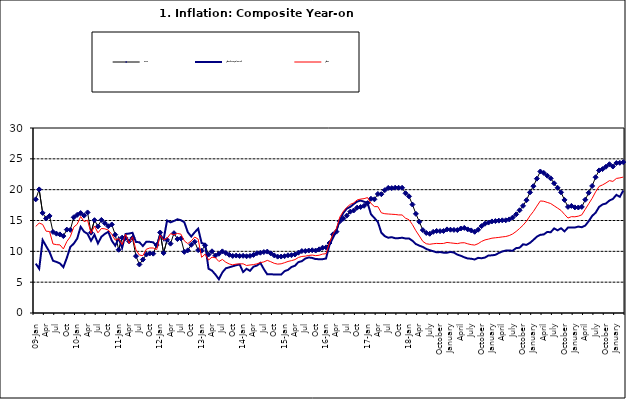
| Category | Food | All Items less Farm Produce | All Items |
|---|---|---|---|
| 09-Jan | 18.436 | 8.013 | 14.034 |
| Feb | 20.041 | 7.178 | 14.584 |
| Mar | 16.233 | 11.842 | 14.366 |
| Apr | 15.342 | 10.85 | 13.268 |
| May | 15.74 | 9.88 | 13.212 |
| June | 13.138 | 8.472 | 11.194 |
| Jul | 12.867 | 8.285 | 11.09 |
| Aug | 12.746 | 8.044 | 11.046 |
| Sep | 12.472 | 7.431 | 10.39 |
| Oct | 13.524 | 8.933 | 11.588 |
| Nov | 13.482 | 10.702 | 12.368 |
| Dec | 15.518 | 11.249 | 13.93 |
| 10-Jan | 15.918 | 12.063 | 14.398 |
| Feb | 16.208 | 13.978 | 15.649 |
| Mar | 15.79 | 13.184 | 14.812 |
| Apr | 16.306 | 12.844 | 15.044 |
| May | 13.023 | 11.711 | 12.915 |
| Jun | 15.053 | 12.686 | 14.099 |
| Jul | 14.043 | 11.287 | 13.002 |
| Aug | 15.09 | 12.366 | 13.702 |
| Sep | 14.57 | 12.83 | 13.65 |
| Oct | 14.065 | 13.168 | 13.45 |
| Nov | 14.351 | 11.746 | 12.766 |
| Dec | 12.701 | 10.917 | 11.815 |
| 11-Jan | 10.255 | 12.118 | 12.08 |
| Feb | 12.221 | 10.569 | 11.1 |
| Mar | 12.169 | 12.815 | 12.779 |
| Apr | 11.629 | 12.882 | 11.291 |
| May | 12.179 | 13.006 | 12.352 |
| Jun | 9.22 | 11.524 | 10.23 |
| Jul | 7.877 | 11.472 | 9.397 |
| Aug | 8.665 | 10.863 | 9.301 |
| Sep | 9.479 | 11.567 | 10.339 |
| Oct | 9.656 | 11.539 | 10.544 |
| Nov | 9.623 | 11.459 | 10.54 |
| Dec | 11.02 | 10.822 | 10.283 |
| 12-Jan | 13.053 | 12.748 | 12.626 |
| 12-Feb | 9.729 | 11.901 | 11.866 |
| 12-Mar | 11.848 | 14.995 | 12.111 |
| Apr | 11.246 | 14.703 | 12.866 |
| May | 12.942 | 14.926 | 12.688 |
| Jun | 11.991 | 15.199 | 12.892 |
| Jul | 12.093 | 15.045 | 12.797 |
| Aug | 9.91 | 14.714 | 11.689 |
| Sep | 10.164 | 13.101 | 11.253 |
| Oct | 11.064 | 12.398 | 11.693 |
| Nov | 11.553 | 13.092 | 12.32 |
| Dec | 10.199 | 13.685 | 11.981 |
| 13-Jan | 10.106 | 11.342 | 9.031 |
| Feb | 10.973 | 11.184 | 9.542 |
| Mar | 9.482 | 7.179 | 8.593 |
| Apr | 10.006 | 6.874 | 9.052 |
| May | 9.321 | 6.227 | 8.964 |
| Jun | 9.606 | 5.472 | 8.353 |
| Jul | 9.994 | 6.58 | 8.682 |
| Aug | 9.723 | 7.245 | 8.231 |
| Sep | 9.437 | 7.41 | 7.952 |
| Oct | 9.249 | 7.579 | 7.807 |
| Nov | 9.313 | 7.75 | 7.931 |
| Dec | 9.253 | 7.872 | 7.957 |
| 14-Jan | 9.271 | 6.648 | 7.977 |
| Feb | 9.207 | 7.166 | 7.707 |
| Mar | 9.254 | 6.836 | 7.783 |
| Apr | 9.414 | 7.508 | 7.851 |
| May | 9.698 | 7.693 | 7.965 |
| Jun | 9.776 | 8.122 | 8.167 |
| Jul | 9.878 | 7.116 | 8.281 |
| Aug | 9.959 | 6.264 | 8.534 |
| Sep | 9.676 | 6.278 | 8.317 |
| Oct | 9.343 | 6.252 | 8.06 |
| Nov | 9.144 | 6.255 | 7.927 |
| Dec | 9.152 | 6.225 | 7.978 |
| 15-Jan | 9.215 | 6.787 | 8.157 |
| Feb | 9.359 | 6.994 | 8.359 |
| Mar | 9.376 | 7.46 | 8.494 |
| Apr | 9.49 | 7.661 | 8.655 |
| May | 9.782 | 8.253 | 9.003 |
| Jun | 10.041 | 8.403 | 9.168 |
| Jul | 10.049 | 8.83 | 9.218 |
| Aug | 10.131 | 9.01 | 9.336 |
| Sep | 10.174 | 8.928 | 9.394 |
| Oct | 10.129 | 8.742 | 9.296 |
| Nov | 10.321 | 8.732 | 9.368 |
| Dec | 10.588 | 8.727 | 9.554 |
| 16-Jan | 10.642 | 8.841 | 9.617 |
| Feb | 11.348 | 11.041 | 11.379 |
| Mar | 12.745 | 12.17 | 12.775 |
| Apr | 13.194 | 13.352 | 13.721 |
| May | 14.861 | 15.054 | 15.577 |
| Jun | 15.302 | 16.224 | 16.48 |
| Jul | 15.799 | 16.929 | 17.127 |
| Aug | 16.427 | 17.208 | 17.609 |
| Sep | 16.622 | 17.666 | 17.852 |
| Oct | 17.09 | 18.067 | 18.33 |
| Nov | 17.191 | 18.241 | 18.476 |
| Dec | 17.388 | 18.052 | 18.547 |
| 17-Jan | 17.818 | 17.867 | 18.719 |
| Feb | 18.528 | 16.011 | 17.78 |
| Mar | 18.436 | 15.404 | 17.256 |
| Apr | 19.303 | 14.75 | 17.244 |
| May | 19.266 | 13.016 | 16.251 |
| Jun | 19.915 | 12.455 | 16.098 |
| Jul | 20.284 | 12.207 | 16.053 |
| Aug | 20.251 | 12.296 | 16.012 |
| Sep | 20.321 | 12.123 | 15.979 |
| Oct | 20.306 | 12.142 | 15.905 |
| Nov | 20.308 | 12.206 | 15.901 |
| Dec | 19.415 | 12.089 | 15.372 |
| 18-Jan | 18.919 | 12.09 | 15.127 |
| Feb | 17.588 | 11.707 | 14.33 |
| Mar | 16.08 | 11.181 | 13.337 |
| Apr | 14.799 | 10.92 | 12.482 |
| May | 13.448 | 10.71 | 11.608 |
| June | 12.977 | 10.387 | 11.231 |
| July | 12.85 | 10.183 | 11.142 |
| August | 13.158 | 10.015 | 11.227 |
| September | 13.309 | 9.838 | 11.284 |
| October | 13.277 | 9.882 | 11.259 |
| November | 13.301 | 9.787 | 11.281 |
| December | 13.559 | 9.771 | 11.442 |
| January | 13.505 | 9.91 | 11.374 |
| February | 13.473 | 9.8 | 11.306 |
| March | 13.451 | 9.461 | 11.251 |
| April | 13.701 | 9.28 | 11.372 |
| May | 13.794 | 9.033 | 11.396 |
| June | 13.558 | 8.841 | 11.217 |
| July | 13.392 | 8.798 | 11.084 |
| August | 13.17 | 8.678 | 11.016 |
| September | 13.507 | 8.945 | 11.244 |
| October | 14.088 | 8.876 | 11.607 |
| November | 14.482 | 8.993 | 11.854 |
| December | 14.667 | 9.331 | 11.982 |
| January | 14.849 | 9.349 | 12.132 |
| February | 14.904 | 9.434 | 12.199 |
| March | 14.977 | 9.732 | 12.257 |
| April | 15.026 | 9.979 | 12.341 |
| May | 15.036 | 10.12 | 12.404 |
| June | 15.175 | 10.128 | 12.559 |
| July | 15.482 | 10.102 | 12.821 |
| August | 15.996 | 10.521 | 13.22 |
| September | 16.66 | 10.581 | 13.707 |
| October | 17.378 | 11.137 | 14.233 |
| November | 18.298 | 11.05 | 14.887 |
| December | 19.562 | 11.374 | 15.753 |
| January | 20.567 | 11.854 | 16.466 |
| February | 21.786 | 12.382 | 17.335 |
| March | 22.948 | 12.673 | 18.171 |
| April | 22.719 | 12.743 | 18.117 |
| May | 22.277 | 13.145 | 17.933 |
| June | 21.829 | 13.094 | 17.751 |
| July | 21.032 | 13.72 | 17.377 |
| August | 20.303 | 13.408 | 17.009 |
| September | 19.566 | 13.745 | 16.63 |
| October | 18.338 | 13.24 | 15.994 |
| November | 17.209 | 13.851 | 15.396 |
| December | 17.37 | 13.873 | 15.625 |
| January | 17.126 | 13.869 | 15.601 |
| February | 17.11 | 14.011 | 15.702 |
| March | 17.203 | 13.914 | 15.915 |
| April | 18.371 | 14.178 | 16.819 |
| May | 19.496 | 14.897 | 17.712 |
| June | 20.603 | 15.747 | 18.596 |
| July | 22.017 | 16.258 | 19.643 |
| August | 23.121 | 17.2 | 20.525 |
| September | 23.336 | 17.601 | 20.774 |
| October | 23.723 | 17.759 | 21.087 |
| November | 24.125 | 18.244 | 21.466 |
| December | 23.754 | 18.492 | 21.344 |
| January | 24.316 | 19.156 | 21.816 |
| February | 24.352 | 18.84 | 21.91 |
| March | 24.451 | 19.856 | 22.043 |